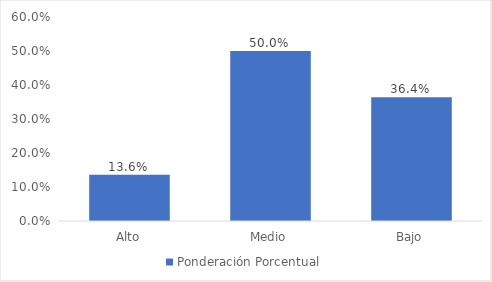
| Category | Ponderación Porcentual |
|---|---|
| Alto | 0.136 |
| Medio | 0.5 |
| Bajo | 0.364 |